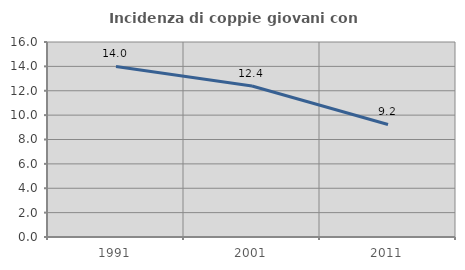
| Category | Incidenza di coppie giovani con figli |
|---|---|
| 1991.0 | 13.994 |
| 2001.0 | 12.391 |
| 2011.0 | 9.235 |